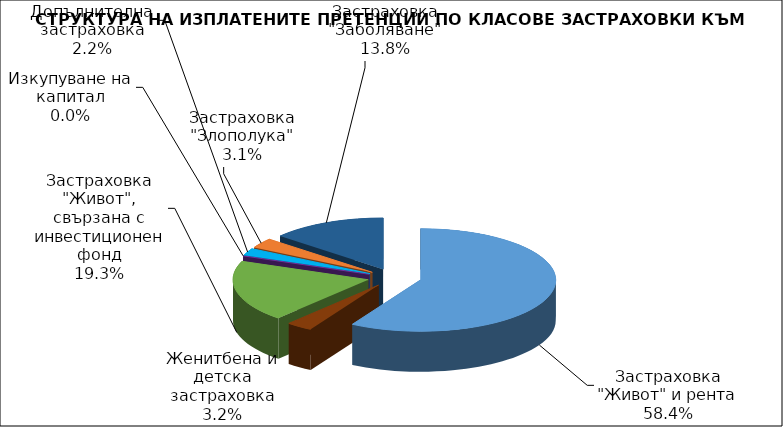
| Category | Застраховка "Живот" и рента |
|---|---|
| Застраховка "Живот" и рента | 25513728.104 |
| Женитбена и детска застраховка | 1387587.196 |
| Застраховка "Живот", свързана с инвестиционен фонд | 8437457.238 |
| Изкупуване на капитал | 0 |
| Допълнителна застраховка | 973772.687 |
| Застраховка "Злополука" | 1362443.576 |
| Застраховка "Заболяване" | 6026924.073 |